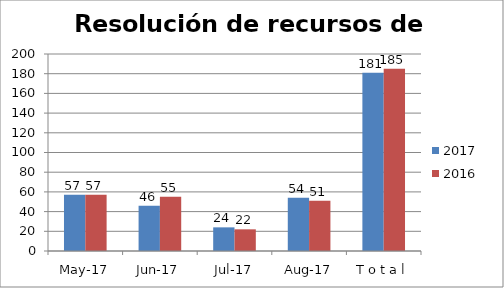
| Category | 2017 | 2016 |
|---|---|---|
| may-17 | 57 | 57 |
| jun-17 | 46 | 55 |
| jul-17 | 24 | 22 |
| ago-17 | 54 | 51 |
| T o t a l | 181 | 185 |